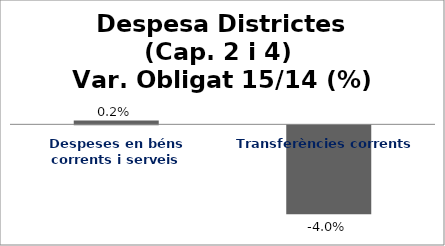
| Category | Series 0 |
|---|---|
| Despeses en béns corrents i serveis | 0.002 |
| Transferències corrents | -0.04 |